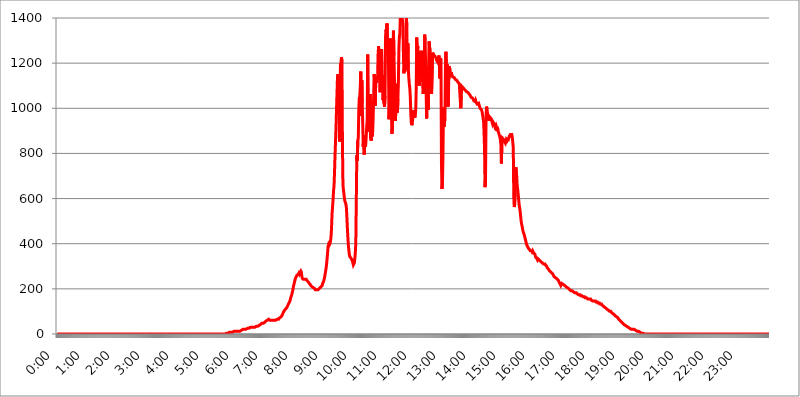
| Category | 2015.04.29. Intenzitás [W/m^2] |
|---|---|
| 0.0 | 0 |
| 0.0006944444444444445 | 0 |
| 0.001388888888888889 | 0 |
| 0.0020833333333333333 | 0 |
| 0.002777777777777778 | 0 |
| 0.003472222222222222 | 0 |
| 0.004166666666666667 | 0 |
| 0.004861111111111111 | 0 |
| 0.005555555555555556 | 0 |
| 0.0062499999999999995 | 0 |
| 0.006944444444444444 | 0 |
| 0.007638888888888889 | 0 |
| 0.008333333333333333 | 0 |
| 0.009027777777777779 | 0 |
| 0.009722222222222222 | 0 |
| 0.010416666666666666 | 0 |
| 0.011111111111111112 | 0 |
| 0.011805555555555555 | 0 |
| 0.012499999999999999 | 0 |
| 0.013194444444444444 | 0 |
| 0.013888888888888888 | 0 |
| 0.014583333333333332 | 0 |
| 0.015277777777777777 | 0 |
| 0.015972222222222224 | 0 |
| 0.016666666666666666 | 0 |
| 0.017361111111111112 | 0 |
| 0.018055555555555557 | 0 |
| 0.01875 | 0 |
| 0.019444444444444445 | 0 |
| 0.02013888888888889 | 0 |
| 0.020833333333333332 | 0 |
| 0.02152777777777778 | 0 |
| 0.022222222222222223 | 0 |
| 0.02291666666666667 | 0 |
| 0.02361111111111111 | 0 |
| 0.024305555555555556 | 0 |
| 0.024999999999999998 | 0 |
| 0.025694444444444447 | 0 |
| 0.02638888888888889 | 0 |
| 0.027083333333333334 | 0 |
| 0.027777777777777776 | 0 |
| 0.02847222222222222 | 0 |
| 0.029166666666666664 | 0 |
| 0.029861111111111113 | 0 |
| 0.030555555555555555 | 0 |
| 0.03125 | 0 |
| 0.03194444444444445 | 0 |
| 0.03263888888888889 | 0 |
| 0.03333333333333333 | 0 |
| 0.034027777777777775 | 0 |
| 0.034722222222222224 | 0 |
| 0.035416666666666666 | 0 |
| 0.036111111111111115 | 0 |
| 0.03680555555555556 | 0 |
| 0.0375 | 0 |
| 0.03819444444444444 | 0 |
| 0.03888888888888889 | 0 |
| 0.03958333333333333 | 0 |
| 0.04027777777777778 | 0 |
| 0.04097222222222222 | 0 |
| 0.041666666666666664 | 0 |
| 0.042361111111111106 | 0 |
| 0.04305555555555556 | 0 |
| 0.043750000000000004 | 0 |
| 0.044444444444444446 | 0 |
| 0.04513888888888889 | 0 |
| 0.04583333333333334 | 0 |
| 0.04652777777777778 | 0 |
| 0.04722222222222222 | 0 |
| 0.04791666666666666 | 0 |
| 0.04861111111111111 | 0 |
| 0.049305555555555554 | 0 |
| 0.049999999999999996 | 0 |
| 0.05069444444444445 | 0 |
| 0.051388888888888894 | 0 |
| 0.052083333333333336 | 0 |
| 0.05277777777777778 | 0 |
| 0.05347222222222222 | 0 |
| 0.05416666666666667 | 0 |
| 0.05486111111111111 | 0 |
| 0.05555555555555555 | 0 |
| 0.05625 | 0 |
| 0.05694444444444444 | 0 |
| 0.057638888888888885 | 0 |
| 0.05833333333333333 | 0 |
| 0.05902777777777778 | 0 |
| 0.059722222222222225 | 0 |
| 0.06041666666666667 | 0 |
| 0.061111111111111116 | 0 |
| 0.06180555555555556 | 0 |
| 0.0625 | 0 |
| 0.06319444444444444 | 0 |
| 0.06388888888888888 | 0 |
| 0.06458333333333334 | 0 |
| 0.06527777777777778 | 0 |
| 0.06597222222222222 | 0 |
| 0.06666666666666667 | 0 |
| 0.06736111111111111 | 0 |
| 0.06805555555555555 | 0 |
| 0.06874999999999999 | 0 |
| 0.06944444444444443 | 0 |
| 0.07013888888888889 | 0 |
| 0.07083333333333333 | 0 |
| 0.07152777777777779 | 0 |
| 0.07222222222222223 | 0 |
| 0.07291666666666667 | 0 |
| 0.07361111111111111 | 0 |
| 0.07430555555555556 | 0 |
| 0.075 | 0 |
| 0.07569444444444444 | 0 |
| 0.0763888888888889 | 0 |
| 0.07708333333333334 | 0 |
| 0.07777777777777778 | 0 |
| 0.07847222222222222 | 0 |
| 0.07916666666666666 | 0 |
| 0.0798611111111111 | 0 |
| 0.08055555555555556 | 0 |
| 0.08125 | 0 |
| 0.08194444444444444 | 0 |
| 0.08263888888888889 | 0 |
| 0.08333333333333333 | 0 |
| 0.08402777777777777 | 0 |
| 0.08472222222222221 | 0 |
| 0.08541666666666665 | 0 |
| 0.08611111111111112 | 0 |
| 0.08680555555555557 | 0 |
| 0.08750000000000001 | 0 |
| 0.08819444444444445 | 0 |
| 0.08888888888888889 | 0 |
| 0.08958333333333333 | 0 |
| 0.09027777777777778 | 0 |
| 0.09097222222222222 | 0 |
| 0.09166666666666667 | 0 |
| 0.09236111111111112 | 0 |
| 0.09305555555555556 | 0 |
| 0.09375 | 0 |
| 0.09444444444444444 | 0 |
| 0.09513888888888888 | 0 |
| 0.09583333333333333 | 0 |
| 0.09652777777777777 | 0 |
| 0.09722222222222222 | 0 |
| 0.09791666666666667 | 0 |
| 0.09861111111111111 | 0 |
| 0.09930555555555555 | 0 |
| 0.09999999999999999 | 0 |
| 0.10069444444444443 | 0 |
| 0.1013888888888889 | 0 |
| 0.10208333333333335 | 0 |
| 0.10277777777777779 | 0 |
| 0.10347222222222223 | 0 |
| 0.10416666666666667 | 0 |
| 0.10486111111111111 | 0 |
| 0.10555555555555556 | 0 |
| 0.10625 | 0 |
| 0.10694444444444444 | 0 |
| 0.1076388888888889 | 0 |
| 0.10833333333333334 | 0 |
| 0.10902777777777778 | 0 |
| 0.10972222222222222 | 0 |
| 0.1111111111111111 | 0 |
| 0.11180555555555556 | 0 |
| 0.11180555555555556 | 0 |
| 0.1125 | 0 |
| 0.11319444444444444 | 0 |
| 0.11388888888888889 | 0 |
| 0.11458333333333333 | 0 |
| 0.11527777777777777 | 0 |
| 0.11597222222222221 | 0 |
| 0.11666666666666665 | 0 |
| 0.1173611111111111 | 0 |
| 0.11805555555555557 | 0 |
| 0.11944444444444445 | 0 |
| 0.12013888888888889 | 0 |
| 0.12083333333333333 | 0 |
| 0.12152777777777778 | 0 |
| 0.12222222222222223 | 0 |
| 0.12291666666666667 | 0 |
| 0.12291666666666667 | 0 |
| 0.12361111111111112 | 0 |
| 0.12430555555555556 | 0 |
| 0.125 | 0 |
| 0.12569444444444444 | 0 |
| 0.12638888888888888 | 0 |
| 0.12708333333333333 | 0 |
| 0.16875 | 0 |
| 0.12847222222222224 | 0 |
| 0.12916666666666668 | 0 |
| 0.12986111111111112 | 0 |
| 0.13055555555555556 | 0 |
| 0.13125 | 0 |
| 0.13194444444444445 | 0 |
| 0.1326388888888889 | 0 |
| 0.13333333333333333 | 0 |
| 0.13402777777777777 | 0 |
| 0.13402777777777777 | 0 |
| 0.13472222222222222 | 0 |
| 0.13541666666666666 | 0 |
| 0.1361111111111111 | 0 |
| 0.13749999999999998 | 0 |
| 0.13819444444444443 | 0 |
| 0.1388888888888889 | 0 |
| 0.13958333333333334 | 0 |
| 0.14027777777777778 | 0 |
| 0.14097222222222222 | 0 |
| 0.14166666666666666 | 0 |
| 0.1423611111111111 | 0 |
| 0.14305555555555557 | 0 |
| 0.14375000000000002 | 0 |
| 0.14444444444444446 | 0 |
| 0.1451388888888889 | 0 |
| 0.1451388888888889 | 0 |
| 0.14652777777777778 | 0 |
| 0.14722222222222223 | 0 |
| 0.14791666666666667 | 0 |
| 0.1486111111111111 | 0 |
| 0.14930555555555555 | 0 |
| 0.15 | 0 |
| 0.15069444444444444 | 0 |
| 0.15138888888888888 | 0 |
| 0.15208333333333332 | 0 |
| 0.15277777777777776 | 0 |
| 0.15347222222222223 | 0 |
| 0.15416666666666667 | 0 |
| 0.15486111111111112 | 0 |
| 0.15555555555555556 | 0 |
| 0.15625 | 0 |
| 0.15694444444444444 | 0 |
| 0.15763888888888888 | 0 |
| 0.15833333333333333 | 0 |
| 0.15902777777777777 | 0 |
| 0.15972222222222224 | 0 |
| 0.16041666666666668 | 0 |
| 0.16111111111111112 | 0 |
| 0.16180555555555556 | 0 |
| 0.1625 | 0 |
| 0.16319444444444445 | 0 |
| 0.1638888888888889 | 0 |
| 0.16458333333333333 | 0 |
| 0.16527777777777777 | 0 |
| 0.16597222222222222 | 0 |
| 0.16666666666666666 | 0 |
| 0.1673611111111111 | 0 |
| 0.16805555555555554 | 0 |
| 0.16874999999999998 | 0 |
| 0.16944444444444443 | 0 |
| 0.17013888888888887 | 0 |
| 0.1708333333333333 | 0 |
| 0.17152777777777775 | 0 |
| 0.17222222222222225 | 0 |
| 0.1729166666666667 | 0 |
| 0.17361111111111113 | 0 |
| 0.17430555555555557 | 0 |
| 0.17500000000000002 | 0 |
| 0.17569444444444446 | 0 |
| 0.1763888888888889 | 0 |
| 0.17708333333333334 | 0 |
| 0.17777777777777778 | 0 |
| 0.17847222222222223 | 0 |
| 0.17916666666666667 | 0 |
| 0.1798611111111111 | 0 |
| 0.18055555555555555 | 0 |
| 0.18125 | 0 |
| 0.18194444444444444 | 0 |
| 0.1826388888888889 | 0 |
| 0.18333333333333335 | 0 |
| 0.1840277777777778 | 0 |
| 0.18472222222222223 | 0 |
| 0.18541666666666667 | 0 |
| 0.18611111111111112 | 0 |
| 0.18680555555555556 | 0 |
| 0.1875 | 0 |
| 0.18819444444444444 | 0 |
| 0.18888888888888888 | 0 |
| 0.18958333333333333 | 0 |
| 0.19027777777777777 | 0 |
| 0.1909722222222222 | 0 |
| 0.19166666666666665 | 0 |
| 0.19236111111111112 | 0 |
| 0.19305555555555554 | 0 |
| 0.19375 | 0 |
| 0.19444444444444445 | 0 |
| 0.1951388888888889 | 0 |
| 0.19583333333333333 | 0 |
| 0.19652777777777777 | 0 |
| 0.19722222222222222 | 0 |
| 0.19791666666666666 | 0 |
| 0.1986111111111111 | 0 |
| 0.19930555555555554 | 0 |
| 0.19999999999999998 | 0 |
| 0.20069444444444443 | 0 |
| 0.20138888888888887 | 0 |
| 0.2020833333333333 | 0 |
| 0.2027777777777778 | 0 |
| 0.2034722222222222 | 0 |
| 0.2041666666666667 | 0 |
| 0.20486111111111113 | 0 |
| 0.20555555555555557 | 0 |
| 0.20625000000000002 | 0 |
| 0.20694444444444446 | 0 |
| 0.2076388888888889 | 0 |
| 0.20833333333333334 | 0 |
| 0.20902777777777778 | 0 |
| 0.20972222222222223 | 0 |
| 0.21041666666666667 | 0 |
| 0.2111111111111111 | 0 |
| 0.21180555555555555 | 0 |
| 0.2125 | 0 |
| 0.21319444444444444 | 0 |
| 0.2138888888888889 | 0 |
| 0.21458333333333335 | 0 |
| 0.2152777777777778 | 0 |
| 0.21597222222222223 | 0 |
| 0.21666666666666667 | 0 |
| 0.21736111111111112 | 0 |
| 0.21805555555555556 | 0 |
| 0.21875 | 0 |
| 0.21944444444444444 | 0 |
| 0.22013888888888888 | 0 |
| 0.22083333333333333 | 0 |
| 0.22152777777777777 | 0 |
| 0.2222222222222222 | 0 |
| 0.22291666666666665 | 0 |
| 0.2236111111111111 | 0 |
| 0.22430555555555556 | 0 |
| 0.225 | 0 |
| 0.22569444444444445 | 0 |
| 0.2263888888888889 | 0 |
| 0.22708333333333333 | 0 |
| 0.22777777777777777 | 0 |
| 0.22847222222222222 | 0 |
| 0.22916666666666666 | 0 |
| 0.2298611111111111 | 0 |
| 0.23055555555555554 | 0 |
| 0.23124999999999998 | 0 |
| 0.23194444444444443 | 0 |
| 0.23263888888888887 | 0 |
| 0.2333333333333333 | 0 |
| 0.2340277777777778 | 0 |
| 0.2347222222222222 | 0 |
| 0.2354166666666667 | 0 |
| 0.23611111111111113 | 0 |
| 0.23680555555555557 | 3.525 |
| 0.23750000000000002 | 3.525 |
| 0.23819444444444446 | 3.525 |
| 0.2388888888888889 | 3.525 |
| 0.23958333333333334 | 3.525 |
| 0.24027777777777778 | 3.525 |
| 0.24097222222222223 | 7.887 |
| 0.24166666666666667 | 7.887 |
| 0.2423611111111111 | 7.887 |
| 0.24305555555555555 | 7.887 |
| 0.24375 | 7.887 |
| 0.24444444444444446 | 7.887 |
| 0.24513888888888888 | 7.887 |
| 0.24583333333333335 | 7.887 |
| 0.2465277777777778 | 7.887 |
| 0.24722222222222223 | 7.887 |
| 0.24791666666666667 | 12.257 |
| 0.24861111111111112 | 12.257 |
| 0.24930555555555556 | 12.257 |
| 0.25 | 12.257 |
| 0.25069444444444444 | 12.257 |
| 0.2513888888888889 | 12.257 |
| 0.2520833333333333 | 12.257 |
| 0.25277777777777777 | 12.257 |
| 0.2534722222222222 | 12.257 |
| 0.25416666666666665 | 12.257 |
| 0.2548611111111111 | 12.257 |
| 0.2555555555555556 | 12.257 |
| 0.25625000000000003 | 12.257 |
| 0.2569444444444445 | 12.257 |
| 0.2576388888888889 | 16.636 |
| 0.25833333333333336 | 16.636 |
| 0.2590277777777778 | 16.636 |
| 0.25972222222222224 | 16.636 |
| 0.2604166666666667 | 21.024 |
| 0.2611111111111111 | 21.024 |
| 0.26180555555555557 | 21.024 |
| 0.2625 | 21.024 |
| 0.26319444444444445 | 21.024 |
| 0.2638888888888889 | 21.024 |
| 0.26458333333333334 | 21.024 |
| 0.2652777777777778 | 21.024 |
| 0.2659722222222222 | 25.419 |
| 0.26666666666666666 | 25.419 |
| 0.2673611111111111 | 25.419 |
| 0.26805555555555555 | 25.419 |
| 0.26875 | 25.419 |
| 0.26944444444444443 | 25.419 |
| 0.2701388888888889 | 29.823 |
| 0.2708333333333333 | 29.823 |
| 0.27152777777777776 | 29.823 |
| 0.2722222222222222 | 29.823 |
| 0.27291666666666664 | 29.823 |
| 0.2736111111111111 | 29.823 |
| 0.2743055555555555 | 29.823 |
| 0.27499999999999997 | 29.823 |
| 0.27569444444444446 | 29.823 |
| 0.27638888888888885 | 29.823 |
| 0.27708333333333335 | 29.823 |
| 0.2777777777777778 | 29.823 |
| 0.27847222222222223 | 29.823 |
| 0.2791666666666667 | 34.234 |
| 0.2798611111111111 | 34.234 |
| 0.28055555555555556 | 34.234 |
| 0.28125 | 34.234 |
| 0.28194444444444444 | 34.234 |
| 0.2826388888888889 | 38.653 |
| 0.2833333333333333 | 38.653 |
| 0.28402777777777777 | 38.653 |
| 0.2847222222222222 | 43.079 |
| 0.28541666666666665 | 43.079 |
| 0.28611111111111115 | 43.079 |
| 0.28680555555555554 | 47.511 |
| 0.28750000000000003 | 47.511 |
| 0.2881944444444445 | 47.511 |
| 0.2888888888888889 | 47.511 |
| 0.28958333333333336 | 47.511 |
| 0.2902777777777778 | 47.511 |
| 0.29097222222222224 | 51.951 |
| 0.2916666666666667 | 51.951 |
| 0.2923611111111111 | 56.398 |
| 0.29305555555555557 | 56.398 |
| 0.29375 | 56.398 |
| 0.29444444444444445 | 60.85 |
| 0.2951388888888889 | 60.85 |
| 0.29583333333333334 | 60.85 |
| 0.2965277777777778 | 65.31 |
| 0.2972222222222222 | 65.31 |
| 0.29791666666666666 | 60.85 |
| 0.2986111111111111 | 60.85 |
| 0.29930555555555555 | 60.85 |
| 0.3 | 60.85 |
| 0.30069444444444443 | 60.85 |
| 0.3013888888888889 | 60.85 |
| 0.3020833333333333 | 60.85 |
| 0.30277777777777776 | 60.85 |
| 0.3034722222222222 | 60.85 |
| 0.30416666666666664 | 60.85 |
| 0.3048611111111111 | 60.85 |
| 0.3055555555555555 | 60.85 |
| 0.30624999999999997 | 60.85 |
| 0.3069444444444444 | 60.85 |
| 0.3076388888888889 | 60.85 |
| 0.30833333333333335 | 65.31 |
| 0.3090277777777778 | 65.31 |
| 0.30972222222222223 | 65.31 |
| 0.3104166666666667 | 65.31 |
| 0.3111111111111111 | 69.775 |
| 0.31180555555555556 | 69.775 |
| 0.3125 | 69.775 |
| 0.31319444444444444 | 74.246 |
| 0.3138888888888889 | 74.246 |
| 0.3145833333333333 | 78.722 |
| 0.31527777777777777 | 83.205 |
| 0.3159722222222222 | 83.205 |
| 0.31666666666666665 | 92.184 |
| 0.31736111111111115 | 96.682 |
| 0.31805555555555554 | 101.184 |
| 0.31875000000000003 | 105.69 |
| 0.3194444444444445 | 105.69 |
| 0.3201388888888889 | 110.201 |
| 0.32083333333333336 | 110.201 |
| 0.3215277777777778 | 114.716 |
| 0.32222222222222224 | 119.235 |
| 0.3229166666666667 | 123.758 |
| 0.3236111111111111 | 128.284 |
| 0.32430555555555557 | 132.814 |
| 0.325 | 137.347 |
| 0.32569444444444445 | 141.884 |
| 0.3263888888888889 | 146.423 |
| 0.32708333333333334 | 155.509 |
| 0.3277777777777778 | 164.605 |
| 0.3284722222222222 | 169.156 |
| 0.32916666666666666 | 178.264 |
| 0.3298611111111111 | 187.378 |
| 0.33055555555555555 | 196.497 |
| 0.33125 | 210.182 |
| 0.33194444444444443 | 219.309 |
| 0.3326388888888889 | 228.436 |
| 0.3333333333333333 | 237.564 |
| 0.3340277777777778 | 246.689 |
| 0.3347222222222222 | 251.251 |
| 0.3354166666666667 | 255.813 |
| 0.3361111111111111 | 260.373 |
| 0.3368055555555556 | 260.373 |
| 0.33749999999999997 | 260.373 |
| 0.33819444444444446 | 264.932 |
| 0.33888888888888885 | 269.49 |
| 0.33958333333333335 | 264.932 |
| 0.34027777777777773 | 269.49 |
| 0.34097222222222223 | 274.047 |
| 0.3416666666666666 | 278.603 |
| 0.3423611111111111 | 274.047 |
| 0.3430555555555555 | 255.813 |
| 0.34375 | 246.689 |
| 0.3444444444444445 | 246.689 |
| 0.3451388888888889 | 242.127 |
| 0.3458333333333334 | 242.127 |
| 0.34652777777777777 | 242.127 |
| 0.34722222222222227 | 242.127 |
| 0.34791666666666665 | 242.127 |
| 0.34861111111111115 | 242.127 |
| 0.34930555555555554 | 242.127 |
| 0.35000000000000003 | 237.564 |
| 0.3506944444444444 | 237.564 |
| 0.3513888888888889 | 233 |
| 0.3520833333333333 | 233 |
| 0.3527777777777778 | 228.436 |
| 0.3534722222222222 | 223.873 |
| 0.3541666666666667 | 223.873 |
| 0.3548611111111111 | 219.309 |
| 0.35555555555555557 | 214.746 |
| 0.35625 | 214.746 |
| 0.35694444444444445 | 210.182 |
| 0.3576388888888889 | 210.182 |
| 0.35833333333333334 | 210.182 |
| 0.3590277777777778 | 205.62 |
| 0.3597222222222222 | 205.62 |
| 0.36041666666666666 | 205.62 |
| 0.3611111111111111 | 201.058 |
| 0.36180555555555555 | 196.497 |
| 0.3625 | 196.497 |
| 0.36319444444444443 | 196.497 |
| 0.3638888888888889 | 196.497 |
| 0.3645833333333333 | 196.497 |
| 0.3652777777777778 | 196.497 |
| 0.3659722222222222 | 196.497 |
| 0.3666666666666667 | 196.497 |
| 0.3673611111111111 | 201.058 |
| 0.3680555555555556 | 201.058 |
| 0.36874999999999997 | 205.62 |
| 0.36944444444444446 | 205.62 |
| 0.37013888888888885 | 210.182 |
| 0.37083333333333335 | 210.182 |
| 0.37152777777777773 | 214.746 |
| 0.37222222222222223 | 223.873 |
| 0.3729166666666666 | 228.436 |
| 0.3736111111111111 | 233 |
| 0.3743055555555555 | 242.127 |
| 0.375 | 251.251 |
| 0.3756944444444445 | 264.932 |
| 0.3763888888888889 | 278.603 |
| 0.3770833333333334 | 292.259 |
| 0.37777777777777777 | 310.44 |
| 0.37847222222222227 | 333.113 |
| 0.37916666666666665 | 360.221 |
| 0.37986111111111115 | 387.202 |
| 0.38055555555555554 | 396.164 |
| 0.38125000000000003 | 391.685 |
| 0.3819444444444444 | 396.164 |
| 0.3826388888888889 | 400.638 |
| 0.3833333333333333 | 414.035 |
| 0.3840277777777778 | 431.833 |
| 0.3847222222222222 | 471.582 |
| 0.3854166666666667 | 532.513 |
| 0.3861111111111111 | 536.82 |
| 0.38680555555555557 | 592.233 |
| 0.3875 | 634.105 |
| 0.38819444444444445 | 654.791 |
| 0.3888888888888889 | 715.858 |
| 0.38958333333333334 | 791.169 |
| 0.3902777777777778 | 787.258 |
| 0.3909722222222222 | 913.766 |
| 0.39166666666666666 | 992.448 |
| 0.3923611111111111 | 988.714 |
| 0.39305555555555555 | 1139.384 |
| 0.39375 | 1150.946 |
| 0.39444444444444443 | 1150.946 |
| 0.3951388888888889 | 1059.756 |
| 0.3958333333333333 | 853.029 |
| 0.3965277777777778 | 1048.508 |
| 0.3972222222222222 | 1193.918 |
| 0.3979166666666667 | 1201.843 |
| 0.3986111111111111 | 1225.859 |
| 0.3993055555555556 | 1209.807 |
| 0.39999999999999997 | 845.365 |
| 0.40069444444444446 | 663.019 |
| 0.40138888888888885 | 638.256 |
| 0.40208333333333335 | 621.613 |
| 0.40277777777777773 | 600.661 |
| 0.40347222222222223 | 588.009 |
| 0.4041666666666666 | 583.779 |
| 0.4048611111111111 | 575.299 |
| 0.4055555555555555 | 558.261 |
| 0.40625 | 515.223 |
| 0.4069444444444445 | 467.187 |
| 0.4076388888888889 | 427.39 |
| 0.4083333333333334 | 391.685 |
| 0.40902777777777777 | 369.23 |
| 0.40972222222222227 | 351.198 |
| 0.41041666666666665 | 342.162 |
| 0.41111111111111115 | 342.162 |
| 0.41180555555555554 | 337.639 |
| 0.41250000000000003 | 333.113 |
| 0.4131944444444444 | 328.584 |
| 0.4138888888888889 | 324.052 |
| 0.4145833333333333 | 314.98 |
| 0.4152777777777778 | 305.898 |
| 0.4159722222222222 | 305.898 |
| 0.4166666666666667 | 314.98 |
| 0.4173611111111111 | 333.113 |
| 0.41805555555555557 | 360.221 |
| 0.41875 | 405.108 |
| 0.41944444444444445 | 592.233 |
| 0.4201388888888889 | 791.169 |
| 0.42083333333333334 | 767.62 |
| 0.4215277777777778 | 856.855 |
| 0.4222222222222222 | 868.305 |
| 0.42291666666666666 | 988.714 |
| 0.4236111111111111 | 1044.762 |
| 0.42430555555555555 | 1052.255 |
| 0.425 | 1093.653 |
| 0.42569444444444443 | 1162.571 |
| 0.4263888888888889 | 966.295 |
| 0.4270833333333333 | 1124.056 |
| 0.4277777777777778 | 1022.323 |
| 0.4284722222222222 | 932.576 |
| 0.4291666666666667 | 829.981 |
| 0.4298611111111111 | 879.719 |
| 0.4305555555555556 | 795.074 |
| 0.43124999999999997 | 841.526 |
| 0.43194444444444446 | 829.981 |
| 0.43263888888888885 | 837.682 |
| 0.43333333333333335 | 875.918 |
| 0.43402777777777773 | 917.534 |
| 0.43472222222222223 | 947.58 |
| 0.4354166666666666 | 1238.014 |
| 0.4361111111111111 | 909.996 |
| 0.4368055555555555 | 917.534 |
| 0.4375 | 894.885 |
| 0.4381944444444445 | 981.244 |
| 0.4388888888888889 | 1063.51 |
| 0.4395833333333334 | 868.305 |
| 0.44027777777777777 | 856.855 |
| 0.44097222222222227 | 894.885 |
| 0.44166666666666665 | 875.918 |
| 0.44236111111111115 | 894.885 |
| 0.44305555555555554 | 958.814 |
| 0.44375000000000003 | 1048.508 |
| 0.4444444444444444 | 1150.946 |
| 0.4451388888888889 | 1127.879 |
| 0.4458333333333333 | 1011.118 |
| 0.4465277777777778 | 1089.873 |
| 0.4472222222222222 | 1139.384 |
| 0.4479166666666667 | 1112.618 |
| 0.4486111111111111 | 1108.816 |
| 0.44930555555555557 | 1139.384 |
| 0.45 | 1238.014 |
| 0.45069444444444445 | 1275.142 |
| 0.4513888888888889 | 1189.969 |
| 0.45208333333333334 | 1150.946 |
| 0.4527777777777778 | 1071.027 |
| 0.4534722222222222 | 1131.708 |
| 0.45416666666666666 | 1233.951 |
| 0.4548611111111111 | 1262.649 |
| 0.45555555555555555 | 1108.816 |
| 0.45625 | 1147.086 |
| 0.45694444444444443 | 1037.277 |
| 0.4576388888888889 | 1044.762 |
| 0.4583333333333333 | 1022.323 |
| 0.4590277777777778 | 1007.383 |
| 0.4597222222222222 | 1056.004 |
| 0.4604166666666667 | 1313.406 |
| 0.4611111111111111 | 1348.524 |
| 0.4618055555555556 | 1335.223 |
| 0.46249999999999997 | 1375.633 |
| 0.46319444444444446 | 1296.248 |
| 0.46388888888888885 | 1242.089 |
| 0.46458333333333335 | 1193.918 |
| 0.46527777777777773 | 951.327 |
| 0.46597222222222223 | 1018.587 |
| 0.4666666666666666 | 1270.964 |
| 0.4673611111111111 | 1309.093 |
| 0.4680555555555555 | 1266.8 |
| 0.46875 | 970.034 |
| 0.4694444444444445 | 887.309 |
| 0.4701388888888889 | 921.298 |
| 0.4708333333333334 | 1186.03 |
| 0.47152777777777777 | 1344.072 |
| 0.47222222222222227 | 1233.951 |
| 0.47291666666666665 | 1135.543 |
| 0.47361111111111115 | 984.98 |
| 0.47430555555555554 | 943.832 |
| 0.47500000000000003 | 1007.383 |
| 0.4756944444444444 | 1108.816 |
| 0.4763888888888889 | 1101.226 |
| 0.4770833333333333 | 981.244 |
| 0.4777777777777778 | 1041.019 |
| 0.4784722222222222 | 1116.426 |
| 0.4791666666666667 | 1266.8 |
| 0.4798611111111111 | 1317.736 |
| 0.48055555555555557 | 1330.826 |
| 0.48125 | 1417.68 |
| 0.48194444444444445 | 1412.921 |
| 0.4826388888888889 | 1403.469 |
| 0.48333333333333334 | 1398.777 |
| 0.4840277777777778 | 1394.106 |
| 0.4847222222222222 | 1371.066 |
| 0.48541666666666666 | 1258.511 |
| 0.4861111111111111 | 1154.814 |
| 0.48680555555555555 | 1174.263 |
| 0.4875 | 1162.571 |
| 0.48819444444444443 | 1221.83 |
| 0.4888888888888889 | 1300.514 |
| 0.4895833333333333 | 1412.921 |
| 0.4902777777777778 | 1361.991 |
| 0.4909722222222222 | 1170.358 |
| 0.4916666666666667 | 1287.761 |
| 0.4923611111111111 | 1178.177 |
| 0.4930555555555556 | 1135.543 |
| 0.49374999999999997 | 1108.816 |
| 0.49444444444444446 | 1089.873 |
| 0.49513888888888885 | 1052.255 |
| 0.49583333333333335 | 981.244 |
| 0.49652777777777773 | 936.33 |
| 0.49722222222222223 | 925.06 |
| 0.4979166666666666 | 932.576 |
| 0.4986111111111111 | 955.071 |
| 0.4993055555555555 | 981.244 |
| 0.5 | 992.448 |
| 0.5006944444444444 | 970.034 |
| 0.5013888888888889 | 958.814 |
| 0.5020833333333333 | 966.295 |
| 0.5027777777777778 | 992.448 |
| 0.5034722222222222 | 1086.097 |
| 0.5041666666666667 | 1313.406 |
| 0.5048611111111111 | 1238.014 |
| 0.5055555555555555 | 1275.142 |
| 0.50625 | 1154.814 |
| 0.5069444444444444 | 1174.263 |
| 0.5076388888888889 | 1101.226 |
| 0.5083333333333333 | 1189.969 |
| 0.5090277777777777 | 1229.899 |
| 0.5097222222222222 | 1254.387 |
| 0.5104166666666666 | 1209.807 |
| 0.5111111111111112 | 1254.387 |
| 0.5118055555555555 | 1233.951 |
| 0.5125000000000001 | 1108.816 |
| 0.5131944444444444 | 1063.51 |
| 0.513888888888889 | 1059.756 |
| 0.5145833333333333 | 1105.019 |
| 0.5152777777777778 | 1326.445 |
| 0.5159722222222222 | 1300.514 |
| 0.5166666666666667 | 1304.795 |
| 0.517361111111111 | 1074.789 |
| 0.5180555555555556 | 955.071 |
| 0.5187499999999999 | 1071.027 |
| 0.5194444444444445 | 1101.226 |
| 0.5201388888888888 | 992.448 |
| 0.5208333333333334 | 1186.03 |
| 0.5215277777777778 | 1296.248 |
| 0.5222222222222223 | 1270.964 |
| 0.5229166666666667 | 1262.649 |
| 0.5236111111111111 | 1258.511 |
| 0.5243055555555556 | 1258.511 |
| 0.525 | 1063.51 |
| 0.5256944444444445 | 1067.267 |
| 0.5263888888888889 | 1246.176 |
| 0.5270833333333333 | 1242.089 |
| 0.5277777777777778 | 1238.014 |
| 0.5284722222222222 | 1233.951 |
| 0.5291666666666667 | 1233.951 |
| 0.5298611111111111 | 1229.899 |
| 0.5305555555555556 | 1225.859 |
| 0.53125 | 1221.83 |
| 0.5319444444444444 | 1213.804 |
| 0.5326388888888889 | 1209.807 |
| 0.5333333333333333 | 1205.82 |
| 0.5340277777777778 | 1209.807 |
| 0.5347222222222222 | 1217.812 |
| 0.5354166666666667 | 1233.951 |
| 0.5361111111111111 | 1238.014 |
| 0.5368055555555555 | 1131.708 |
| 0.5375 | 1221.83 |
| 0.5381944444444444 | 1213.804 |
| 0.5388888888888889 | 751.803 |
| 0.5395833333333333 | 642.4 |
| 0.5402777777777777 | 671.22 |
| 0.5409722222222222 | 787.258 |
| 0.5416666666666666 | 1003.65 |
| 0.5423611111111112 | 917.534 |
| 0.5430555555555555 | 917.534 |
| 0.5437500000000001 | 955.071 |
| 0.5444444444444444 | 1178.177 |
| 0.545138888888889 | 1250.275 |
| 0.5458333333333333 | 1166.46 |
| 0.5465277777777778 | 1059.756 |
| 0.5472222222222222 | 1193.918 |
| 0.5479166666666667 | 1007.383 |
| 0.548611111111111 | 1029.798 |
| 0.5493055555555556 | 1186.03 |
| 0.5499999999999999 | 1182.099 |
| 0.5506944444444445 | 1174.263 |
| 0.5513888888888888 | 1158.689 |
| 0.5520833333333334 | 1150.946 |
| 0.5527777777777778 | 1158.689 |
| 0.5534722222222223 | 1147.086 |
| 0.5541666666666667 | 1143.232 |
| 0.5548611111111111 | 1139.384 |
| 0.5555555555555556 | 1135.543 |
| 0.55625 | 1135.543 |
| 0.5569444444444445 | 1135.543 |
| 0.5576388888888889 | 1131.708 |
| 0.5583333333333333 | 1127.879 |
| 0.5590277777777778 | 1131.708 |
| 0.5597222222222222 | 1131.708 |
| 0.5604166666666667 | 1124.056 |
| 0.5611111111111111 | 1120.238 |
| 0.5618055555555556 | 1116.426 |
| 0.5625 | 1112.618 |
| 0.5631944444444444 | 1112.618 |
| 0.5638888888888889 | 1108.816 |
| 0.5645833333333333 | 1108.816 |
| 0.5652777777777778 | 1105.019 |
| 0.5659722222222222 | 999.916 |
| 0.5666666666666667 | 1056.004 |
| 0.5673611111111111 | 1097.437 |
| 0.5680555555555555 | 1093.653 |
| 0.56875 | 1093.653 |
| 0.5694444444444444 | 1089.873 |
| 0.5701388888888889 | 1086.097 |
| 0.5708333333333333 | 1089.873 |
| 0.5715277777777777 | 1082.324 |
| 0.5722222222222222 | 1078.555 |
| 0.5729166666666666 | 1082.324 |
| 0.5736111111111112 | 1074.789 |
| 0.5743055555555555 | 1074.789 |
| 0.5750000000000001 | 1071.027 |
| 0.5756944444444444 | 1071.027 |
| 0.576388888888889 | 1067.267 |
| 0.5770833333333333 | 1067.267 |
| 0.5777777777777778 | 1063.51 |
| 0.5784722222222222 | 1059.756 |
| 0.5791666666666667 | 1056.004 |
| 0.579861111111111 | 1052.255 |
| 0.5805555555555556 | 1048.508 |
| 0.5812499999999999 | 1044.762 |
| 0.5819444444444445 | 1044.762 |
| 0.5826388888888888 | 1044.762 |
| 0.5833333333333334 | 1041.019 |
| 0.5840277777777778 | 1037.277 |
| 0.5847222222222223 | 1029.798 |
| 0.5854166666666667 | 1041.019 |
| 0.5861111111111111 | 1026.06 |
| 0.5868055555555556 | 1033.537 |
| 0.5875 | 1026.06 |
| 0.5881944444444445 | 1022.323 |
| 0.5888888888888889 | 1018.587 |
| 0.5895833333333333 | 1022.323 |
| 0.5902777777777778 | 1018.587 |
| 0.5909722222222222 | 1022.323 |
| 0.5916666666666667 | 1014.852 |
| 0.5923611111111111 | 1011.118 |
| 0.5930555555555556 | 999.916 |
| 0.59375 | 996.182 |
| 0.5944444444444444 | 996.182 |
| 0.5951388888888889 | 992.448 |
| 0.5958333333333333 | 984.98 |
| 0.5965277777777778 | 984.98 |
| 0.5972222222222222 | 984.98 |
| 0.5979166666666667 | 943.832 |
| 0.5986111111111111 | 891.099 |
| 0.5993055555555555 | 818.392 |
| 0.6 | 650.667 |
| 0.6006944444444444 | 695.666 |
| 0.6013888888888889 | 958.814 |
| 0.6020833333333333 | 1007.383 |
| 0.6027777777777777 | 996.182 |
| 0.6034722222222222 | 977.508 |
| 0.6041666666666666 | 966.295 |
| 0.6048611111111112 | 955.071 |
| 0.6055555555555555 | 943.832 |
| 0.6062500000000001 | 962.555 |
| 0.6069444444444444 | 966.295 |
| 0.607638888888889 | 958.814 |
| 0.6083333333333333 | 955.071 |
| 0.6090277777777778 | 947.58 |
| 0.6097222222222222 | 940.082 |
| 0.6104166666666667 | 932.576 |
| 0.611111111111111 | 940.082 |
| 0.6118055555555556 | 940.082 |
| 0.6124999999999999 | 932.576 |
| 0.6131944444444445 | 925.06 |
| 0.6138888888888888 | 917.534 |
| 0.6145833333333334 | 917.534 |
| 0.6152777777777778 | 925.06 |
| 0.6159722222222223 | 917.534 |
| 0.6166666666666667 | 898.668 |
| 0.6173611111111111 | 917.534 |
| 0.6180555555555556 | 902.447 |
| 0.61875 | 898.668 |
| 0.6194444444444445 | 887.309 |
| 0.6201388888888889 | 879.719 |
| 0.6208333333333333 | 872.114 |
| 0.6215277777777778 | 860.676 |
| 0.6222222222222222 | 837.682 |
| 0.6229166666666667 | 755.766 |
| 0.6236111111111111 | 849.199 |
| 0.6243055555555556 | 868.305 |
| 0.625 | 868.305 |
| 0.6256944444444444 | 868.305 |
| 0.6263888888888889 | 860.676 |
| 0.6270833333333333 | 853.029 |
| 0.6277777777777778 | 853.029 |
| 0.6284722222222222 | 845.365 |
| 0.6291666666666667 | 853.029 |
| 0.6298611111111111 | 845.365 |
| 0.6305555555555555 | 864.493 |
| 0.63125 | 864.493 |
| 0.6319444444444444 | 868.305 |
| 0.6326388888888889 | 860.676 |
| 0.6333333333333333 | 868.305 |
| 0.6340277777777777 | 875.918 |
| 0.6347222222222222 | 879.719 |
| 0.6354166666666666 | 883.516 |
| 0.6361111111111112 | 879.719 |
| 0.6368055555555555 | 883.516 |
| 0.6375000000000001 | 883.516 |
| 0.6381944444444444 | 872.114 |
| 0.638888888888889 | 849.199 |
| 0.6395833333333333 | 826.123 |
| 0.6402777777777778 | 609.062 |
| 0.6409722222222222 | 562.53 |
| 0.6416666666666667 | 575.299 |
| 0.642361111111111 | 617.436 |
| 0.6430555555555556 | 739.877 |
| 0.6437499999999999 | 735.89 |
| 0.6444444444444445 | 695.666 |
| 0.6451388888888888 | 654.791 |
| 0.6458333333333334 | 638.256 |
| 0.6465277777777778 | 617.436 |
| 0.6472222222222223 | 592.233 |
| 0.6479166666666667 | 571.049 |
| 0.6486111111111111 | 558.261 |
| 0.6493055555555556 | 541.121 |
| 0.65 | 519.555 |
| 0.6506944444444445 | 497.836 |
| 0.6513888888888889 | 484.735 |
| 0.6520833333333333 | 475.972 |
| 0.6527777777777778 | 462.786 |
| 0.6534722222222222 | 453.968 |
| 0.6541666666666667 | 449.551 |
| 0.6548611111111111 | 440.702 |
| 0.6555555555555556 | 431.833 |
| 0.65625 | 422.943 |
| 0.6569444444444444 | 414.035 |
| 0.6576388888888889 | 405.108 |
| 0.6583333333333333 | 396.164 |
| 0.6590277777777778 | 391.685 |
| 0.6597222222222222 | 387.202 |
| 0.6604166666666667 | 382.715 |
| 0.6611111111111111 | 378.224 |
| 0.6618055555555555 | 378.224 |
| 0.6625 | 373.729 |
| 0.6631944444444444 | 369.23 |
| 0.6638888888888889 | 369.23 |
| 0.6645833333333333 | 369.23 |
| 0.6652777777777777 | 369.23 |
| 0.6659722222222222 | 364.728 |
| 0.6666666666666666 | 369.23 |
| 0.6673611111111111 | 364.728 |
| 0.6680555555555556 | 360.221 |
| 0.6687500000000001 | 360.221 |
| 0.6694444444444444 | 355.712 |
| 0.6701388888888888 | 351.198 |
| 0.6708333333333334 | 342.162 |
| 0.6715277777777778 | 337.639 |
| 0.6722222222222222 | 337.639 |
| 0.6729166666666666 | 333.113 |
| 0.6736111111111112 | 328.584 |
| 0.6743055555555556 | 333.113 |
| 0.6749999999999999 | 333.113 |
| 0.6756944444444444 | 328.584 |
| 0.6763888888888889 | 328.584 |
| 0.6770833333333334 | 324.052 |
| 0.6777777777777777 | 324.052 |
| 0.6784722222222223 | 319.517 |
| 0.6791666666666667 | 319.517 |
| 0.6798611111111111 | 319.517 |
| 0.6805555555555555 | 314.98 |
| 0.68125 | 314.98 |
| 0.6819444444444445 | 310.44 |
| 0.6826388888888889 | 310.44 |
| 0.6833333333333332 | 310.44 |
| 0.6840277777777778 | 310.44 |
| 0.6847222222222222 | 305.898 |
| 0.6854166666666667 | 305.898 |
| 0.686111111111111 | 301.354 |
| 0.6868055555555556 | 296.808 |
| 0.6875 | 292.259 |
| 0.6881944444444444 | 292.259 |
| 0.688888888888889 | 287.709 |
| 0.6895833333333333 | 283.156 |
| 0.6902777777777778 | 283.156 |
| 0.6909722222222222 | 278.603 |
| 0.6916666666666668 | 278.603 |
| 0.6923611111111111 | 274.047 |
| 0.6930555555555555 | 274.047 |
| 0.69375 | 269.49 |
| 0.6944444444444445 | 269.49 |
| 0.6951388888888889 | 264.932 |
| 0.6958333333333333 | 260.373 |
| 0.6965277777777777 | 255.813 |
| 0.6972222222222223 | 255.813 |
| 0.6979166666666666 | 251.251 |
| 0.6986111111111111 | 251.251 |
| 0.6993055555555556 | 251.251 |
| 0.7000000000000001 | 246.689 |
| 0.7006944444444444 | 246.689 |
| 0.7013888888888888 | 242.127 |
| 0.7020833333333334 | 242.127 |
| 0.7027777777777778 | 237.564 |
| 0.7034722222222222 | 237.564 |
| 0.7041666666666666 | 228.436 |
| 0.7048611111111112 | 223.873 |
| 0.7055555555555556 | 223.873 |
| 0.7062499999999999 | 214.746 |
| 0.7069444444444444 | 219.309 |
| 0.7076388888888889 | 223.873 |
| 0.7083333333333334 | 223.873 |
| 0.7090277777777777 | 223.873 |
| 0.7097222222222223 | 219.309 |
| 0.7104166666666667 | 219.309 |
| 0.7111111111111111 | 219.309 |
| 0.7118055555555555 | 214.746 |
| 0.7125 | 214.746 |
| 0.7131944444444445 | 210.182 |
| 0.7138888888888889 | 210.182 |
| 0.7145833333333332 | 210.182 |
| 0.7152777777777778 | 205.62 |
| 0.7159722222222222 | 205.62 |
| 0.7166666666666667 | 205.62 |
| 0.717361111111111 | 201.058 |
| 0.7180555555555556 | 201.058 |
| 0.71875 | 196.497 |
| 0.7194444444444444 | 196.497 |
| 0.720138888888889 | 191.937 |
| 0.7208333333333333 | 191.937 |
| 0.7215277777777778 | 191.937 |
| 0.7222222222222222 | 191.937 |
| 0.7229166666666668 | 191.937 |
| 0.7236111111111111 | 187.378 |
| 0.7243055555555555 | 187.378 |
| 0.725 | 187.378 |
| 0.7256944444444445 | 182.82 |
| 0.7263888888888889 | 182.82 |
| 0.7270833333333333 | 182.82 |
| 0.7277777777777777 | 182.82 |
| 0.7284722222222223 | 182.82 |
| 0.7291666666666666 | 178.264 |
| 0.7298611111111111 | 178.264 |
| 0.7305555555555556 | 178.264 |
| 0.7312500000000001 | 173.709 |
| 0.7319444444444444 | 173.709 |
| 0.7326388888888888 | 173.709 |
| 0.7333333333333334 | 173.709 |
| 0.7340277777777778 | 169.156 |
| 0.7347222222222222 | 169.156 |
| 0.7354166666666666 | 169.156 |
| 0.7361111111111112 | 169.156 |
| 0.7368055555555556 | 169.156 |
| 0.7374999999999999 | 164.605 |
| 0.7381944444444444 | 164.605 |
| 0.7388888888888889 | 164.605 |
| 0.7395833333333334 | 164.605 |
| 0.7402777777777777 | 160.056 |
| 0.7409722222222223 | 160.056 |
| 0.7416666666666667 | 160.056 |
| 0.7423611111111111 | 160.056 |
| 0.7430555555555555 | 160.056 |
| 0.74375 | 155.509 |
| 0.7444444444444445 | 155.509 |
| 0.7451388888888889 | 155.509 |
| 0.7458333333333332 | 155.509 |
| 0.7465277777777778 | 155.509 |
| 0.7472222222222222 | 155.509 |
| 0.7479166666666667 | 155.509 |
| 0.748611111111111 | 150.964 |
| 0.7493055555555556 | 150.964 |
| 0.75 | 150.964 |
| 0.7506944444444444 | 146.423 |
| 0.751388888888889 | 146.423 |
| 0.7520833333333333 | 146.423 |
| 0.7527777777777778 | 146.423 |
| 0.7534722222222222 | 146.423 |
| 0.7541666666666668 | 146.423 |
| 0.7548611111111111 | 146.423 |
| 0.7555555555555555 | 141.884 |
| 0.75625 | 141.884 |
| 0.7569444444444445 | 141.884 |
| 0.7576388888888889 | 141.884 |
| 0.7583333333333333 | 137.347 |
| 0.7590277777777777 | 137.347 |
| 0.7597222222222223 | 137.347 |
| 0.7604166666666666 | 137.347 |
| 0.7611111111111111 | 132.814 |
| 0.7618055555555556 | 132.814 |
| 0.7625000000000001 | 132.814 |
| 0.7631944444444444 | 132.814 |
| 0.7638888888888888 | 128.284 |
| 0.7645833333333334 | 128.284 |
| 0.7652777777777778 | 128.284 |
| 0.7659722222222222 | 123.758 |
| 0.7666666666666666 | 123.758 |
| 0.7673611111111112 | 119.235 |
| 0.7680555555555556 | 119.235 |
| 0.7687499999999999 | 119.235 |
| 0.7694444444444444 | 114.716 |
| 0.7701388888888889 | 114.716 |
| 0.7708333333333334 | 110.201 |
| 0.7715277777777777 | 110.201 |
| 0.7722222222222223 | 110.201 |
| 0.7729166666666667 | 105.69 |
| 0.7736111111111111 | 105.69 |
| 0.7743055555555555 | 101.184 |
| 0.775 | 101.184 |
| 0.7756944444444445 | 101.184 |
| 0.7763888888888889 | 101.184 |
| 0.7770833333333332 | 96.682 |
| 0.7777777777777778 | 96.682 |
| 0.7784722222222222 | 92.184 |
| 0.7791666666666667 | 92.184 |
| 0.779861111111111 | 92.184 |
| 0.7805555555555556 | 87.692 |
| 0.78125 | 87.692 |
| 0.7819444444444444 | 83.205 |
| 0.782638888888889 | 83.205 |
| 0.7833333333333333 | 78.722 |
| 0.7840277777777778 | 78.722 |
| 0.7847222222222222 | 78.722 |
| 0.7854166666666668 | 74.246 |
| 0.7861111111111111 | 74.246 |
| 0.7868055555555555 | 69.775 |
| 0.7875 | 65.31 |
| 0.7881944444444445 | 65.31 |
| 0.7888888888888889 | 60.85 |
| 0.7895833333333333 | 60.85 |
| 0.7902777777777777 | 56.398 |
| 0.7909722222222223 | 56.398 |
| 0.7916666666666666 | 51.951 |
| 0.7923611111111111 | 51.951 |
| 0.7930555555555556 | 47.511 |
| 0.7937500000000001 | 47.511 |
| 0.7944444444444444 | 43.079 |
| 0.7951388888888888 | 38.653 |
| 0.7958333333333334 | 38.653 |
| 0.7965277777777778 | 38.653 |
| 0.7972222222222222 | 38.653 |
| 0.7979166666666666 | 34.234 |
| 0.7986111111111112 | 34.234 |
| 0.7993055555555556 | 34.234 |
| 0.7999999999999999 | 34.234 |
| 0.8006944444444444 | 29.823 |
| 0.8013888888888889 | 29.823 |
| 0.8020833333333334 | 29.823 |
| 0.8027777777777777 | 25.419 |
| 0.8034722222222223 | 25.419 |
| 0.8041666666666667 | 25.419 |
| 0.8048611111111111 | 21.024 |
| 0.8055555555555555 | 21.024 |
| 0.80625 | 21.024 |
| 0.8069444444444445 | 21.024 |
| 0.8076388888888889 | 21.024 |
| 0.8083333333333332 | 21.024 |
| 0.8090277777777778 | 21.024 |
| 0.8097222222222222 | 16.636 |
| 0.8104166666666667 | 16.636 |
| 0.811111111111111 | 16.636 |
| 0.8118055555555556 | 16.636 |
| 0.8125 | 12.257 |
| 0.8131944444444444 | 12.257 |
| 0.813888888888889 | 12.257 |
| 0.8145833333333333 | 12.257 |
| 0.8152777777777778 | 12.257 |
| 0.8159722222222222 | 7.887 |
| 0.8166666666666668 | 7.887 |
| 0.8173611111111111 | 7.887 |
| 0.8180555555555555 | 3.525 |
| 0.81875 | 3.525 |
| 0.8194444444444445 | 3.525 |
| 0.8201388888888889 | 3.525 |
| 0.8208333333333333 | 3.525 |
| 0.8215277777777777 | 3.525 |
| 0.8222222222222223 | 3.525 |
| 0.8229166666666666 | 3.525 |
| 0.8236111111111111 | 0 |
| 0.8243055555555556 | 3.525 |
| 0.8250000000000001 | 0 |
| 0.8256944444444444 | 0 |
| 0.8263888888888888 | 0 |
| 0.8270833333333334 | 0 |
| 0.8277777777777778 | 0 |
| 0.8284722222222222 | 0 |
| 0.8291666666666666 | 0 |
| 0.8298611111111112 | 0 |
| 0.8305555555555556 | 0 |
| 0.8312499999999999 | 0 |
| 0.8319444444444444 | 0 |
| 0.8326388888888889 | 0 |
| 0.8333333333333334 | 0 |
| 0.8340277777777777 | 0 |
| 0.8347222222222223 | 0 |
| 0.8354166666666667 | 0 |
| 0.8361111111111111 | 0 |
| 0.8368055555555555 | 0 |
| 0.8375 | 0 |
| 0.8381944444444445 | 0 |
| 0.8388888888888889 | 0 |
| 0.8395833333333332 | 0 |
| 0.8402777777777778 | 0 |
| 0.8409722222222222 | 0 |
| 0.8416666666666667 | 0 |
| 0.842361111111111 | 0 |
| 0.8430555555555556 | 0 |
| 0.84375 | 0 |
| 0.8444444444444444 | 0 |
| 0.845138888888889 | 0 |
| 0.8458333333333333 | 0 |
| 0.8465277777777778 | 0 |
| 0.8472222222222222 | 0 |
| 0.8479166666666668 | 0 |
| 0.8486111111111111 | 0 |
| 0.8493055555555555 | 0 |
| 0.85 | 0 |
| 0.8506944444444445 | 0 |
| 0.8513888888888889 | 0 |
| 0.8520833333333333 | 0 |
| 0.8527777777777777 | 0 |
| 0.8534722222222223 | 0 |
| 0.8541666666666666 | 0 |
| 0.8548611111111111 | 0 |
| 0.8555555555555556 | 0 |
| 0.8562500000000001 | 0 |
| 0.8569444444444444 | 0 |
| 0.8576388888888888 | 0 |
| 0.8583333333333334 | 0 |
| 0.8590277777777778 | 0 |
| 0.8597222222222222 | 0 |
| 0.8604166666666666 | 0 |
| 0.8611111111111112 | 0 |
| 0.8618055555555556 | 0 |
| 0.8624999999999999 | 0 |
| 0.8631944444444444 | 0 |
| 0.8638888888888889 | 0 |
| 0.8645833333333334 | 0 |
| 0.8652777777777777 | 0 |
| 0.8659722222222223 | 0 |
| 0.8666666666666667 | 0 |
| 0.8673611111111111 | 0 |
| 0.8680555555555555 | 0 |
| 0.86875 | 0 |
| 0.8694444444444445 | 0 |
| 0.8701388888888889 | 0 |
| 0.8708333333333332 | 0 |
| 0.8715277777777778 | 0 |
| 0.8722222222222222 | 0 |
| 0.8729166666666667 | 0 |
| 0.873611111111111 | 0 |
| 0.8743055555555556 | 0 |
| 0.875 | 0 |
| 0.8756944444444444 | 0 |
| 0.876388888888889 | 0 |
| 0.8770833333333333 | 0 |
| 0.8777777777777778 | 0 |
| 0.8784722222222222 | 0 |
| 0.8791666666666668 | 0 |
| 0.8798611111111111 | 0 |
| 0.8805555555555555 | 0 |
| 0.88125 | 0 |
| 0.8819444444444445 | 0 |
| 0.8826388888888889 | 0 |
| 0.8833333333333333 | 0 |
| 0.8840277777777777 | 0 |
| 0.8847222222222223 | 0 |
| 0.8854166666666666 | 0 |
| 0.8861111111111111 | 0 |
| 0.8868055555555556 | 0 |
| 0.8875000000000001 | 0 |
| 0.8881944444444444 | 0 |
| 0.8888888888888888 | 0 |
| 0.8895833333333334 | 0 |
| 0.8902777777777778 | 0 |
| 0.8909722222222222 | 0 |
| 0.8916666666666666 | 0 |
| 0.8923611111111112 | 0 |
| 0.8930555555555556 | 0 |
| 0.8937499999999999 | 0 |
| 0.8944444444444444 | 0 |
| 0.8951388888888889 | 0 |
| 0.8958333333333334 | 0 |
| 0.8965277777777777 | 0 |
| 0.8972222222222223 | 0 |
| 0.8979166666666667 | 0 |
| 0.8986111111111111 | 0 |
| 0.8993055555555555 | 0 |
| 0.9 | 0 |
| 0.9006944444444445 | 0 |
| 0.9013888888888889 | 0 |
| 0.9020833333333332 | 0 |
| 0.9027777777777778 | 0 |
| 0.9034722222222222 | 0 |
| 0.9041666666666667 | 0 |
| 0.904861111111111 | 0 |
| 0.9055555555555556 | 0 |
| 0.90625 | 0 |
| 0.9069444444444444 | 0 |
| 0.907638888888889 | 0 |
| 0.9083333333333333 | 0 |
| 0.9090277777777778 | 0 |
| 0.9097222222222222 | 0 |
| 0.9104166666666668 | 0 |
| 0.9111111111111111 | 0 |
| 0.9118055555555555 | 0 |
| 0.9125 | 0 |
| 0.9131944444444445 | 0 |
| 0.9138888888888889 | 0 |
| 0.9145833333333333 | 0 |
| 0.9152777777777777 | 0 |
| 0.9159722222222223 | 0 |
| 0.9166666666666666 | 0 |
| 0.9173611111111111 | 0 |
| 0.9180555555555556 | 0 |
| 0.9187500000000001 | 0 |
| 0.9194444444444444 | 0 |
| 0.9201388888888888 | 0 |
| 0.9208333333333334 | 0 |
| 0.9215277777777778 | 0 |
| 0.9222222222222222 | 0 |
| 0.9229166666666666 | 0 |
| 0.9236111111111112 | 0 |
| 0.9243055555555556 | 0 |
| 0.9249999999999999 | 0 |
| 0.9256944444444444 | 0 |
| 0.9263888888888889 | 0 |
| 0.9270833333333334 | 0 |
| 0.9277777777777777 | 0 |
| 0.9284722222222223 | 0 |
| 0.9291666666666667 | 0 |
| 0.9298611111111111 | 0 |
| 0.9305555555555555 | 0 |
| 0.93125 | 0 |
| 0.9319444444444445 | 0 |
| 0.9326388888888889 | 0 |
| 0.9333333333333332 | 0 |
| 0.9340277777777778 | 0 |
| 0.9347222222222222 | 0 |
| 0.9354166666666667 | 0 |
| 0.936111111111111 | 0 |
| 0.9368055555555556 | 0 |
| 0.9375 | 0 |
| 0.9381944444444444 | 0 |
| 0.938888888888889 | 0 |
| 0.9395833333333333 | 0 |
| 0.9402777777777778 | 0 |
| 0.9409722222222222 | 0 |
| 0.9416666666666668 | 0 |
| 0.9423611111111111 | 0 |
| 0.9430555555555555 | 0 |
| 0.94375 | 0 |
| 0.9444444444444445 | 0 |
| 0.9451388888888889 | 0 |
| 0.9458333333333333 | 0 |
| 0.9465277777777777 | 0 |
| 0.9472222222222223 | 0 |
| 0.9479166666666666 | 0 |
| 0.9486111111111111 | 0 |
| 0.9493055555555556 | 0 |
| 0.9500000000000001 | 0 |
| 0.9506944444444444 | 0 |
| 0.9513888888888888 | 0 |
| 0.9520833333333334 | 0 |
| 0.9527777777777778 | 0 |
| 0.9534722222222222 | 0 |
| 0.9541666666666666 | 0 |
| 0.9548611111111112 | 0 |
| 0.9555555555555556 | 0 |
| 0.9562499999999999 | 0 |
| 0.9569444444444444 | 0 |
| 0.9576388888888889 | 0 |
| 0.9583333333333334 | 0 |
| 0.9590277777777777 | 0 |
| 0.9597222222222223 | 0 |
| 0.9604166666666667 | 0 |
| 0.9611111111111111 | 0 |
| 0.9618055555555555 | 0 |
| 0.9625 | 0 |
| 0.9631944444444445 | 0 |
| 0.9638888888888889 | 0 |
| 0.9645833333333332 | 0 |
| 0.9652777777777778 | 0 |
| 0.9659722222222222 | 0 |
| 0.9666666666666667 | 0 |
| 0.967361111111111 | 0 |
| 0.9680555555555556 | 0 |
| 0.96875 | 0 |
| 0.9694444444444444 | 0 |
| 0.970138888888889 | 0 |
| 0.9708333333333333 | 0 |
| 0.9715277777777778 | 0 |
| 0.9722222222222222 | 0 |
| 0.9729166666666668 | 0 |
| 0.9736111111111111 | 0 |
| 0.9743055555555555 | 0 |
| 0.975 | 0 |
| 0.9756944444444445 | 0 |
| 0.9763888888888889 | 0 |
| 0.9770833333333333 | 0 |
| 0.9777777777777777 | 0 |
| 0.9784722222222223 | 0 |
| 0.9791666666666666 | 0 |
| 0.9798611111111111 | 0 |
| 0.9805555555555556 | 0 |
| 0.9812500000000001 | 0 |
| 0.9819444444444444 | 0 |
| 0.9826388888888888 | 0 |
| 0.9833333333333334 | 0 |
| 0.9840277777777778 | 0 |
| 0.9847222222222222 | 0 |
| 0.9854166666666666 | 0 |
| 0.9861111111111112 | 0 |
| 0.9868055555555556 | 0 |
| 0.9874999999999999 | 0 |
| 0.9881944444444444 | 0 |
| 0.9888888888888889 | 0 |
| 0.9895833333333334 | 0 |
| 0.9902777777777777 | 0 |
| 0.9909722222222223 | 0 |
| 0.9916666666666667 | 0 |
| 0.9923611111111111 | 0 |
| 0.9930555555555555 | 0 |
| 0.99375 | 0 |
| 0.9944444444444445 | 0 |
| 0.9951388888888889 | 0 |
| 0.9958333333333332 | 0 |
| 0.9965277777777778 | 0 |
| 0.9972222222222222 | 0 |
| 0.9979166666666667 | 0 |
| 0.998611111111111 | 0 |
| 0.9993055555555556 | 0 |